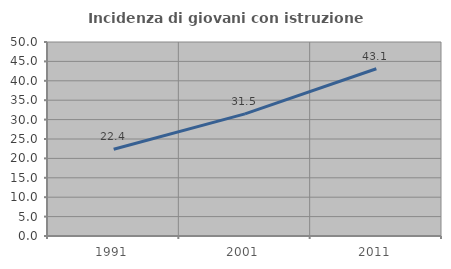
| Category | Incidenza di giovani con istruzione universitaria |
|---|---|
| 1991.0 | 22.352 |
| 2001.0 | 31.469 |
| 2011.0 | 43.104 |